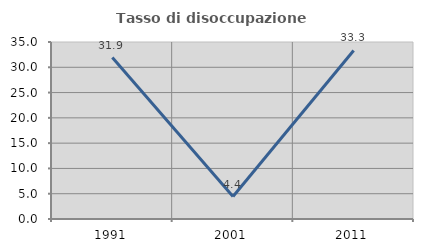
| Category | Tasso di disoccupazione giovanile  |
|---|---|
| 1991.0 | 31.915 |
| 2001.0 | 4.444 |
| 2011.0 | 33.333 |